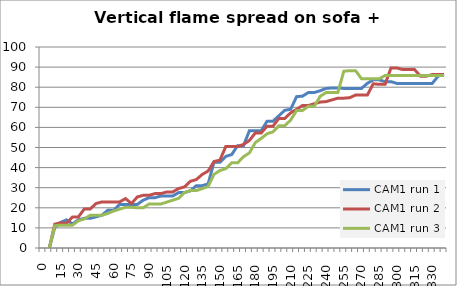
| Category | CAM1 run 1 | CAM1 run 2 | CAM1 run 3 |
|---|---|---|---|
| 0.0 | -1 | -1 | -1 |
| 5.0 | -1 | -1 | -1 |
| 10.0 | 10.243 | 11.868 | 11.063 |
| 15.0 | 12.753 | 12.537 | 11.357 |
| 20.0 | 13.996 | 12.255 | 11.357 |
| 25.0 | 11.949 | 15.431 | 11.357 |
| 30.0 | 13.996 | 15.431 | 13.515 |
| 35.0 | 14.753 | 19.346 | 14.425 |
| 40.0 | 14.753 | 19.346 | 16.265 |
| 45.0 | 15.53 | 22.123 | 16.265 |
| 50.0 | 16.322 | 22.935 | 16.265 |
| 55.0 | 18.778 | 22.935 | 17.194 |
| 60.0 | 18.778 | 22.935 | 18.41 |
| 65.0 | 21.703 | 22.935 | 19.333 |
| 70.0 | 21.703 | 24.573 | 20.26 |
| 75.0 | 21.703 | 22.123 | 20.26 |
| 80.0 | 21.703 | 25.398 | 20.003 |
| 85.0 | 23.789 | 26.227 | 20.003 |
| 90.0 | 25.037 | 26.227 | 21.891 |
| 95.0 | 25.037 | 27.059 | 21.891 |
| 100.0 | 25.875 | 27.059 | 21.891 |
| 105.0 | 25.875 | 27.895 | 22.838 |
| 110.0 | 25.875 | 27.895 | 23.787 |
| 115.0 | 27.569 | 29.574 | 24.738 |
| 120.0 | 27.569 | 30.417 | 27.598 |
| 125.0 | 28.424 | 33.205 | 28.554 |
| 130.0 | 31.017 | 34.05 | 28.554 |
| 135.0 | 31.017 | 36.594 | 29.511 |
| 140.0 | 31.889 | 38.298 | 30.638 |
| 145.0 | 42.643 | 43.008 | 36.638 |
| 150.0 | 42.643 | 43.721 | 38.545 |
| 155.0 | 45.593 | 50.501 | 39.5 |
| 160.0 | 46.474 | 50.501 | 42.37 |
| 165.0 | 50.916 | 50.501 | 42.37 |
| 170.0 | 50.916 | 51.503 | 45.402 |
| 175.0 | 58.347 | 53.503 | 47.315 |
| 180.0 | 58.347 | 57.209 | 52.433 |
| 185.0 | 58.347 | 57.209 | 54.525 |
| 190.0 | 63.094 | 60.632 | 56.837 |
| 195.0 | 63.094 | 60.632 | 57.782 |
| 200.0 | 65.803 | 64.483 | 60.837 |
| 205.0 | 68.52 | 64.483 | 60.837 |
| 210.0 | 69.022 | 67.266 | 63.674 |
| 215.0 | 75.308 | 68.974 | 68.417 |
| 220.0 | 75.537 | 70.903 | 68.417 |
| 225.0 | 77.344 | 70.903 | 70.516 |
| 230.0 | 77.344 | 71.757 | 70.516 |
| 235.0 | 78.249 | 72.611 | 75.463 |
| 240.0 | 79.384 | 72.834 | 77.362 |
| 245.0 | 79.625 | 73.686 | 77.362 |
| 250.0 | 79.625 | 74.54 | 77.362 |
| 255.0 | 79.384 | 74.54 | 87.926 |
| 260.0 | 79.384 | 74.767 | 88.241 |
| 265.0 | 79.384 | 76.1 | 88.241 |
| 270.0 | 79.384 | 76.1 | 84.21 |
| 275.0 | 81.93 | 76.1 | 84.21 |
| 280.0 | 83.652 | 81.719 | 84.21 |
| 285.0 | 83.652 | 81.406 | 84.21 |
| 290.0 | 82.766 | 81.406 | 85.783 |
| 295.0 | 82.766 | 89.575 | 85.783 |
| 300.0 | 81.882 | 89.575 | 85.783 |
| 305.0 | 81.882 | 88.756 | 85.783 |
| 310.0 | 81.882 | 88.756 | 85.783 |
| 315.0 | 81.882 | 88.756 | 85.783 |
| 320.0 | 81.882 | 85.491 | 85.783 |
| 325.0 | 81.882 | 85.491 | 85.783 |
| 330.0 | 81.882 | 86.305 | 85.783 |
| 335.0 | 85.509 | 86.305 | 85.783 |
| 340.0 | 86.451 | 86.305 | 85.783 |